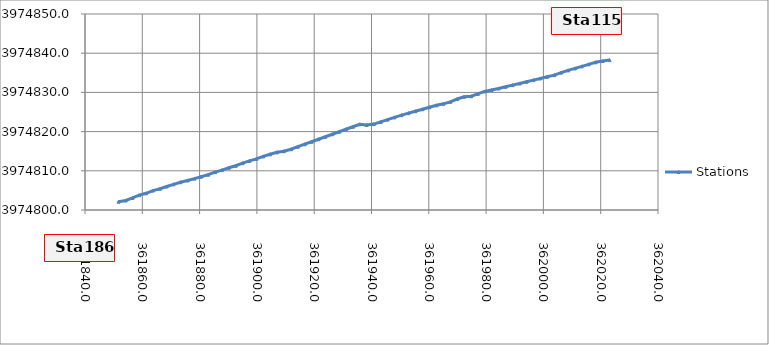
| Category | Stations |
|---|---|
| 361851.7 | 3974802.117 |
| 361854.2 | 3974802.427 |
| 361856.6 | 3974803.084 |
| 361858.9 | 3974803.782 |
| 361861.3 | 3974804.262 |
| 361863.7 | 3974804.959 |
| 361866.2 | 3974805.43 |
| 361868.5 | 3974805.992 |
| 361870.9 | 3974806.555 |
| 361873.3 | 3974807.089 |
| 361875.8 | 3974807.542 |
| 361878.2 | 3974808.007 |
| 361880.5 | 3974808.496 |
| 361883.0 | 3974809.013 |
| 361885.4 | 3974809.657 |
| 361887.8 | 3974810.181 |
| 361890.2 | 3974810.771 |
| 361892.6 | 3974811.292 |
| 361895.0 | 3974811.955 |
| 361897.4 | 3974812.538 |
| 361899.8 | 3974813.032 |
| 361902.2 | 3974813.678 |
| 361904.6 | 3974814.22 |
| 361907.0 | 3974814.71 |
| 361909.4 | 3974814.992 |
| 361911.9 | 3974815.509 |
| 361914.3 | 3974816.145 |
| 361916.7 | 3974816.782 |
| 361919.1 | 3974817.418 |
| 361921.5 | 3974818.054 |
| 361923.9 | 3974818.691 |
| 361926.3 | 3974819.327 |
| 361928.7 | 3974819.964 |
| 361931.1 | 3974820.6 |
| 361933.5 | 3974821.236 |
| 361935.9 | 3974821.873 |
| 361938.3 | 3974821.709 |
| 361940.8 | 3974821.911 |
| 361943.2 | 3974822.48 |
| 361945.6 | 3974823.055 |
| 361948.0 | 3974823.63 |
| 361950.5 | 3974824.204 |
| 361952.9 | 3974824.706 |
| 361955.3 | 3974825.207 |
| 361957.8 | 3974825.708 |
| 361960.2 | 3974826.21 |
| 361962.7 | 3974826.711 |
| 361965.1 | 3974827.085 |
| 361967.5 | 3974827.592 |
| 361969.9 | 3974828.309 |
| 361972.3 | 3974828.874 |
| 361974.8 | 3974829.014 |
| 361977.1 | 3974829.615 |
| 361979.5 | 3974830.246 |
| 361981.9 | 3974830.611 |
| 361984.4 | 3974831.01 |
| 361986.8 | 3974831.435 |
| 361989.2 | 3974831.859 |
| 361991.7 | 3974832.284 |
| 361994.1 | 3974832.708 |
| 361996.5 | 3974833.133 |
| 361998.9 | 3974833.558 |
| 362001.3 | 3974833.982 |
| 362003.8 | 3974834.408 |
| 362006.2 | 3974835.047 |
| 362008.6 | 3974835.617 |
| 362011.0 | 3974836.124 |
| 362013.4 | 3974836.644 |
| 362015.8 | 3974837.164 |
| 362018.2 | 3974837.685 |
| 362020.7 | 3974838.027 |
| 362023.1 | 3974838.251 |